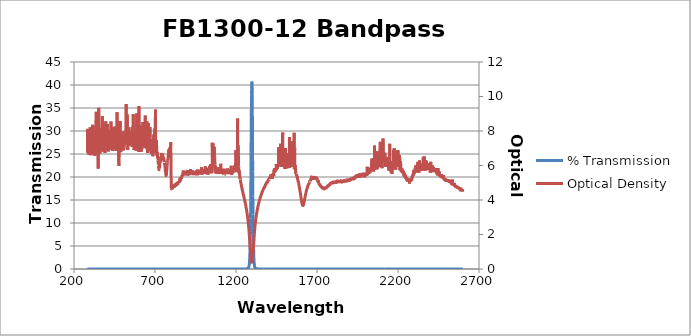
| Category | % Transmission |
|---|---|
| 2600.0 | 0.003 |
| 2599.0 | 0.003 |
| 2598.0 | 0.003 |
| 2597.0 | 0.002 |
| 2596.0 | 0.003 |
| 2595.0 | 0.003 |
| 2594.0 | 0.003 |
| 2593.0 | 0.002 |
| 2592.0 | 0.003 |
| 2591.0 | 0.003 |
| 2590.0 | 0.002 |
| 2589.0 | 0.002 |
| 2588.0 | 0.003 |
| 2587.0 | 0.003 |
| 2586.0 | 0.003 |
| 2585.0 | 0.002 |
| 2584.0 | 0.002 |
| 2583.0 | 0.002 |
| 2582.0 | 0.002 |
| 2581.0 | 0.002 |
| 2580.0 | 0.002 |
| 2579.0 | 0.002 |
| 2578.0 | 0.002 |
| 2577.0 | 0.002 |
| 2576.0 | 0.002 |
| 2575.0 | 0.002 |
| 2574.0 | 0.002 |
| 2573.0 | 0.002 |
| 2572.0 | 0.002 |
| 2571.0 | 0.002 |
| 2570.0 | 0.002 |
| 2569.0 | 0.002 |
| 2568.0 | 0.002 |
| 2567.0 | 0.002 |
| 2566.0 | 0.002 |
| 2565.0 | 0.002 |
| 2564.0 | 0.002 |
| 2563.0 | 0.002 |
| 2562.0 | 0.002 |
| 2561.0 | 0.002 |
| 2560.0 | 0.001 |
| 2559.0 | 0.002 |
| 2558.0 | 0.002 |
| 2557.0 | 0.002 |
| 2556.0 | 0.001 |
| 2555.0 | 0.001 |
| 2554.0 | 0.001 |
| 2553.0 | 0.002 |
| 2552.0 | 0.001 |
| 2551.0 | 0.001 |
| 2550.0 | 0.001 |
| 2549.0 | 0.001 |
| 2548.0 | 0.001 |
| 2547.0 | 0.001 |
| 2546.0 | 0.001 |
| 2545.0 | 0.001 |
| 2544.0 | 0.001 |
| 2543.0 | 0.001 |
| 2542.0 | 0.001 |
| 2541.0 | 0.001 |
| 2540.0 | 0.001 |
| 2539.0 | 0.001 |
| 2538.0 | 0.001 |
| 2537.0 | 0.001 |
| 2536.0 | 0.001 |
| 2535.0 | 0.001 |
| 2534.0 | 0.001 |
| 2533.0 | 0.001 |
| 2532.0 | 0.001 |
| 2531.0 | 0.001 |
| 2530.0 | 0.001 |
| 2529.0 | 0.001 |
| 2528.0 | 0.001 |
| 2527.0 | 0.001 |
| 2526.0 | 0.001 |
| 2525.0 | 0.001 |
| 2524.0 | 0.001 |
| 2523.0 | 0.001 |
| 2522.0 | 0.001 |
| 2521.0 | 0.001 |
| 2520.0 | 0.001 |
| 2519.0 | 0.001 |
| 2518.0 | 0.001 |
| 2517.0 | 0.001 |
| 2516.0 | 0.001 |
| 2515.0 | 0.001 |
| 2514.0 | 0.001 |
| 2513.0 | 0.001 |
| 2512.0 | 0.001 |
| 2511.0 | 0.001 |
| 2510.0 | 0.001 |
| 2509.0 | 0.001 |
| 2508.0 | 0.001 |
| 2507.0 | 0.001 |
| 2506.0 | 0.001 |
| 2505.0 | 0.001 |
| 2504.0 | 0.001 |
| 2503.0 | 0.001 |
| 2502.0 | 0.001 |
| 2501.0 | 0.001 |
| 2500.0 | 0.001 |
| 2499.0 | 0.001 |
| 2498.0 | 0.001 |
| 2497.0 | 0.001 |
| 2496.0 | 0.001 |
| 2495.0 | 0.001 |
| 2494.0 | 0.001 |
| 2493.0 | 0.001 |
| 2492.0 | 0.001 |
| 2491.0 | 0.001 |
| 2490.0 | 0.001 |
| 2489.0 | 0.001 |
| 2488.0 | 0.001 |
| 2487.0 | 0.001 |
| 2486.0 | 0.001 |
| 2485.0 | 0.001 |
| 2484.0 | 0.001 |
| 2483.0 | 0.001 |
| 2482.0 | 0 |
| 2481.0 | 0.001 |
| 2480.0 | 0.001 |
| 2479.0 | 0 |
| 2478.0 | 0.001 |
| 2477.0 | 0 |
| 2476.0 | 0 |
| 2475.0 | 0 |
| 2474.0 | 0 |
| 2473.0 | 0 |
| 2472.0 | 0.001 |
| 2471.0 | 0 |
| 2470.0 | 0 |
| 2469.0 | 0 |
| 2468.0 | 0 |
| 2467.0 | 0 |
| 2466.0 | 0 |
| 2465.0 | 0 |
| 2464.0 | 0 |
| 2463.0 | 0 |
| 2462.0 | 0 |
| 2461.0 | 0 |
| 2460.0 | 0 |
| 2459.0 | 0 |
| 2458.0 | 0 |
| 2457.0 | 0 |
| 2456.0 | 0 |
| 2455.0 | 0 |
| 2454.0 | 0 |
| 2453.0 | 0 |
| 2452.0 | 0 |
| 2451.0 | 0 |
| 2450.0 | 0 |
| 2449.0 | 0 |
| 2448.0 | 0 |
| 2447.0 | 0 |
| 2446.0 | 0 |
| 2445.0 | 0 |
| 2444.0 | 0 |
| 2443.0 | 0 |
| 2442.0 | 0 |
| 2441.0 | 0 |
| 2440.0 | 0 |
| 2439.0 | 0 |
| 2438.0 | 0 |
| 2437.0 | 0 |
| 2436.0 | 0 |
| 2435.0 | 0 |
| 2434.0 | 0 |
| 2433.0 | 0 |
| 2432.0 | 0 |
| 2431.0 | 0 |
| 2430.0 | 0 |
| 2429.0 | 0 |
| 2428.0 | 0 |
| 2427.0 | 0 |
| 2426.0 | 0 |
| 2425.0 | 0 |
| 2424.0 | 0 |
| 2423.0 | 0 |
| 2422.0 | 0 |
| 2421.0 | 0 |
| 2420.0 | 0 |
| 2419.0 | 0 |
| 2418.0 | 0 |
| 2417.0 | 0 |
| 2416.0 | 0 |
| 2415.0 | 0 |
| 2414.0 | 0 |
| 2413.0 | 0 |
| 2412.0 | 0 |
| 2411.0 | 0 |
| 2410.0 | 0 |
| 2409.0 | 0 |
| 2408.0 | 0 |
| 2407.0 | 0 |
| 2406.0 | 0 |
| 2405.0 | 0 |
| 2404.0 | 0 |
| 2403.0 | 0 |
| 2402.0 | 0 |
| 2401.0 | 0 |
| 2400.0 | 0 |
| 2399.0 | 0 |
| 2398.0 | 0 |
| 2397.0 | 0 |
| 2396.0 | 0 |
| 2395.0 | 0 |
| 2394.0 | 0 |
| 2393.0 | 0 |
| 2392.0 | 0 |
| 2391.0 | 0 |
| 2390.0 | 0 |
| 2389.0 | 0 |
| 2388.0 | 0 |
| 2387.0 | 0 |
| 2386.0 | 0 |
| 2385.0 | 0 |
| 2384.0 | 0 |
| 2383.0 | 0 |
| 2382.0 | 0 |
| 2381.0 | 0 |
| 2380.0 | 0 |
| 2379.0 | 0 |
| 2378.0 | 0 |
| 2377.0 | 0 |
| 2376.0 | 0 |
| 2375.0 | 0 |
| 2374.0 | 0 |
| 2373.0 | 0 |
| 2372.0 | 0 |
| 2371.0 | 0 |
| 2370.0 | 0 |
| 2369.0 | 0 |
| 2368.0 | 0 |
| 2367.0 | 0 |
| 2366.0 | 0 |
| 2365.0 | 0 |
| 2364.0 | 0 |
| 2363.0 | 0 |
| 2362.0 | 0 |
| 2361.0 | 0 |
| 2360.0 | 0 |
| 2359.0 | 0 |
| 2358.0 | 0 |
| 2357.0 | 0 |
| 2356.0 | 0 |
| 2355.0 | 0 |
| 2354.0 | 0 |
| 2353.0 | 0 |
| 2352.0 | 0 |
| 2351.0 | 0 |
| 2350.0 | 0 |
| 2349.0 | 0 |
| 2348.0 | 0 |
| 2347.0 | 0 |
| 2346.0 | 0 |
| 2345.0 | 0 |
| 2344.0 | 0 |
| 2343.0 | 0 |
| 2342.0 | 0 |
| 2341.0 | 0 |
| 2340.0 | 0 |
| 2339.0 | 0 |
| 2338.0 | 0 |
| 2337.0 | 0 |
| 2336.0 | 0 |
| 2335.0 | 0 |
| 2334.0 | 0 |
| 2333.0 | 0 |
| 2332.0 | 0 |
| 2331.0 | 0 |
| 2330.0 | 0 |
| 2329.0 | 0 |
| 2328.0 | 0 |
| 2327.0 | 0 |
| 2326.0 | 0 |
| 2325.0 | 0 |
| 2324.0 | 0 |
| 2323.0 | 0 |
| 2322.0 | 0 |
| 2321.0 | 0 |
| 2320.0 | 0 |
| 2319.0 | 0 |
| 2318.0 | 0 |
| 2317.0 | 0 |
| 2316.0 | 0 |
| 2315.0 | 0 |
| 2314.0 | 0 |
| 2313.0 | 0 |
| 2312.0 | 0 |
| 2311.0 | 0 |
| 2310.0 | 0 |
| 2309.0 | 0 |
| 2308.0 | 0 |
| 2307.0 | 0 |
| 2306.0 | 0 |
| 2305.0 | 0 |
| 2304.0 | 0 |
| 2303.0 | 0 |
| 2302.0 | 0 |
| 2301.0 | 0 |
| 2300.0 | 0 |
| 2299.0 | 0 |
| 2298.0 | 0 |
| 2297.0 | 0 |
| 2296.0 | 0 |
| 2295.0 | 0 |
| 2294.0 | 0 |
| 2293.0 | 0 |
| 2292.0 | 0 |
| 2291.0 | 0 |
| 2290.0 | 0 |
| 2289.0 | 0.001 |
| 2288.0 | 0 |
| 2287.0 | 0 |
| 2286.0 | 0.001 |
| 2285.0 | 0.001 |
| 2284.0 | 0.001 |
| 2283.0 | 0.001 |
| 2282.0 | 0.001 |
| 2281.0 | 0.001 |
| 2280.0 | 0.001 |
| 2279.0 | 0.001 |
| 2278.0 | 0.001 |
| 2277.0 | 0.001 |
| 2276.0 | 0.001 |
| 2275.0 | 0.001 |
| 2274.0 | 0.001 |
| 2273.0 | 0.001 |
| 2272.0 | 0.001 |
| 2271.0 | 0.001 |
| 2270.0 | 0.001 |
| 2269.0 | 0.001 |
| 2268.0 | 0.001 |
| 2267.0 | 0.001 |
| 2266.0 | 0.001 |
| 2265.0 | 0.001 |
| 2264.0 | 0.001 |
| 2263.0 | 0.001 |
| 2262.0 | 0.001 |
| 2261.0 | 0.001 |
| 2260.0 | 0.001 |
| 2259.0 | 0.001 |
| 2258.0 | 0.001 |
| 2257.0 | 0.001 |
| 2256.0 | 0.001 |
| 2255.0 | 0.001 |
| 2254.0 | 0 |
| 2253.0 | 0 |
| 2252.0 | 0.001 |
| 2251.0 | 0.001 |
| 2250.0 | 0.001 |
| 2249.0 | 0 |
| 2248.0 | 0 |
| 2247.0 | 0 |
| 2246.0 | 0 |
| 2245.0 | 0 |
| 2244.0 | 0 |
| 2243.0 | 0 |
| 2242.0 | 0 |
| 2241.0 | 0 |
| 2240.0 | 0 |
| 2239.0 | 0 |
| 2238.0 | 0 |
| 2237.0 | 0 |
| 2236.0 | 0 |
| 2235.0 | 0 |
| 2234.0 | 0 |
| 2233.0 | 0 |
| 2232.0 | 0 |
| 2231.0 | 0 |
| 2230.0 | 0 |
| 2229.0 | 0 |
| 2228.0 | 0 |
| 2227.0 | 0 |
| 2226.0 | 0 |
| 2225.0 | 0 |
| 2224.0 | 0 |
| 2223.0 | 0 |
| 2222.0 | 0 |
| 2221.0 | 0 |
| 2220.0 | 0 |
| 2219.0 | 0 |
| 2218.0 | 0 |
| 2217.0 | 0 |
| 2216.0 | 0 |
| 2215.0 | 0 |
| 2214.0 | 0 |
| 2213.0 | 0 |
| 2212.0 | 0 |
| 2211.0 | 0 |
| 2210.0 | 0 |
| 2209.0 | 0 |
| 2208.0 | 0 |
| 2207.0 | 0 |
| 2206.0 | 0 |
| 2205.0 | 0 |
| 2204.0 | 0 |
| 2203.0 | 0 |
| 2202.0 | 0 |
| 2201.0 | 0 |
| 2200.0 | 0 |
| 2199.0 | 0 |
| 2198.0 | 0 |
| 2197.0 | 0 |
| 2196.0 | 0 |
| 2195.0 | 0 |
| 2194.0 | 0 |
| 2193.0 | 0 |
| 2192.0 | 0 |
| 2191.0 | 0 |
| 2190.0 | 0 |
| 2189.0 | 0 |
| 2188.0 | 0 |
| 2187.0 | 0 |
| 2186.0 | 0 |
| 2185.0 | 0 |
| 2184.0 | 0 |
| 2183.0 | 0 |
| 2182.0 | 0 |
| 2181.0 | 0 |
| 2180.0 | 0 |
| 2179.0 | 0 |
| 2178.0 | 0 |
| 2177.0 | 0 |
| 2176.0 | 0 |
| 2175.0 | 0 |
| 2174.0 | 0 |
| 2173.0 | 0 |
| 2172.0 | 0 |
| 2171.0 | 0 |
| 2170.0 | 0 |
| 2169.0 | 0 |
| 2168.0 | 0 |
| 2167.0 | 0 |
| 2166.0 | 0 |
| 2165.0 | 0 |
| 2164.0 | 0 |
| 2163.0 | 0 |
| 2162.0 | 0 |
| 2161.0 | 0 |
| 2160.0 | 0 |
| 2159.0 | 0 |
| 2158.0 | 0 |
| 2157.0 | 0 |
| 2156.0 | 0 |
| 2155.0 | 0 |
| 2154.0 | 0 |
| 2153.0 | 0 |
| 2152.0 | 0 |
| 2151.0 | 0 |
| 2150.0 | 0 |
| 2149.0 | 0 |
| 2148.0 | 0 |
| 2147.0 | 0 |
| 2146.0 | 0 |
| 2145.0 | 0 |
| 2144.0 | 0 |
| 2143.0 | 0 |
| 2142.0 | 0 |
| 2141.0 | 0 |
| 2140.0 | 0 |
| 2139.0 | 0 |
| 2138.0 | 0 |
| 2137.0 | 0 |
| 2136.0 | 0 |
| 2135.0 | 0 |
| 2134.0 | 0 |
| 2133.0 | 0 |
| 2132.0 | 0 |
| 2131.0 | 0 |
| 2130.0 | 0 |
| 2129.0 | 0 |
| 2128.0 | 0 |
| 2127.0 | 0 |
| 2126.0 | 0 |
| 2125.0 | 0 |
| 2124.0 | 0 |
| 2123.0 | 0 |
| 2122.0 | 0 |
| 2121.0 | 0 |
| 2120.0 | 0 |
| 2119.0 | 0 |
| 2118.0 | 0 |
| 2117.0 | 0 |
| 2116.0 | 0 |
| 2115.0 | 0 |
| 2114.0 | 0 |
| 2113.0 | 0 |
| 2112.0 | 0 |
| 2111.0 | 0 |
| 2110.0 | 0 |
| 2109.0 | 0 |
| 2108.0 | 0 |
| 2107.0 | 0 |
| 2106.0 | 0 |
| 2105.0 | 0 |
| 2104.0 | 0 |
| 2103.0 | 0 |
| 2102.0 | 0 |
| 2101.0 | 0 |
| 2100.0 | 0 |
| 2099.0 | 0 |
| 2098.0 | 0 |
| 2097.0 | 0 |
| 2096.0 | 0 |
| 2095.0 | 0 |
| 2094.0 | 0 |
| 2093.0 | 0 |
| 2092.0 | 0 |
| 2091.0 | 0 |
| 2090.0 | 0 |
| 2089.0 | 0 |
| 2088.0 | 0 |
| 2087.0 | 0 |
| 2086.0 | 0 |
| 2085.0 | 0 |
| 2084.0 | 0 |
| 2083.0 | 0 |
| 2082.0 | 0 |
| 2081.0 | 0 |
| 2080.0 | 0 |
| 2079.0 | 0 |
| 2078.0 | 0 |
| 2077.0 | 0 |
| 2076.0 | 0 |
| 2075.0 | 0 |
| 2074.0 | 0 |
| 2073.0 | 0 |
| 2072.0 | 0 |
| 2071.0 | 0 |
| 2070.0 | 0 |
| 2069.0 | 0 |
| 2068.0 | 0 |
| 2067.0 | 0 |
| 2066.0 | 0 |
| 2065.0 | 0 |
| 2064.0 | 0 |
| 2063.0 | 0 |
| 2062.0 | 0 |
| 2061.0 | 0 |
| 2060.0 | 0 |
| 2059.0 | 0 |
| 2058.0 | 0 |
| 2057.0 | 0 |
| 2056.0 | 0 |
| 2055.0 | 0 |
| 2054.0 | 0 |
| 2053.0 | 0 |
| 2052.0 | 0 |
| 2051.0 | 0 |
| 2050.0 | 0 |
| 2049.0 | 0 |
| 2048.0 | 0 |
| 2047.0 | 0 |
| 2046.0 | 0 |
| 2045.0 | 0 |
| 2044.0 | 0 |
| 2043.0 | 0 |
| 2042.0 | 0 |
| 2041.0 | 0 |
| 2040.0 | 0 |
| 2039.0 | 0 |
| 2038.0 | 0 |
| 2037.0 | 0 |
| 2036.0 | 0 |
| 2035.0 | 0 |
| 2034.0 | 0 |
| 2033.0 | 0 |
| 2032.0 | 0 |
| 2031.0 | 0 |
| 2030.0 | 0 |
| 2029.0 | 0 |
| 2028.0 | 0 |
| 2027.0 | 0 |
| 2026.0 | 0 |
| 2025.0 | 0 |
| 2024.0 | 0 |
| 2023.0 | 0 |
| 2022.0 | 0 |
| 2021.0 | 0 |
| 2020.0 | 0 |
| 2019.0 | 0 |
| 2018.0 | 0 |
| 2017.0 | 0 |
| 2016.0 | 0 |
| 2015.0 | 0 |
| 2014.0 | 0 |
| 2013.0 | 0 |
| 2012.0 | 0 |
| 2011.0 | 0 |
| 2010.0 | 0 |
| 2009.0 | 0 |
| 2008.0 | 0 |
| 2007.0 | 0 |
| 2006.0 | 0 |
| 2005.0 | 0 |
| 2004.0 | 0 |
| 2003.0 | 0 |
| 2002.0 | 0 |
| 2001.0 | 0 |
| 2000.0 | 0 |
| 1999.0 | 0 |
| 1998.0 | 0 |
| 1997.0 | 0 |
| 1996.0 | 0 |
| 1995.0 | 0 |
| 1994.0 | 0 |
| 1993.0 | 0 |
| 1992.0 | 0 |
| 1991.0 | 0 |
| 1990.0 | 0 |
| 1989.0 | 0 |
| 1988.0 | 0 |
| 1987.0 | 0 |
| 1986.0 | 0 |
| 1985.0 | 0 |
| 1984.0 | 0 |
| 1983.0 | 0 |
| 1982.0 | 0 |
| 1981.0 | 0 |
| 1980.0 | 0 |
| 1979.0 | 0 |
| 1978.0 | 0 |
| 1977.0 | 0 |
| 1976.0 | 0 |
| 1975.0 | 0 |
| 1974.0 | 0 |
| 1973.0 | 0 |
| 1972.0 | 0 |
| 1971.0 | 0 |
| 1970.0 | 0 |
| 1969.0 | 0 |
| 1968.0 | 0 |
| 1967.0 | 0 |
| 1966.0 | 0.001 |
| 1965.0 | 0 |
| 1964.0 | 0 |
| 1963.0 | 0 |
| 1962.0 | 0 |
| 1961.0 | 0 |
| 1960.0 | 0 |
| 1959.0 | 0 |
| 1958.0 | 0 |
| 1957.0 | 0 |
| 1956.0 | 0 |
| 1955.0 | 0 |
| 1954.0 | 0 |
| 1953.0 | 0 |
| 1952.0 | 0 |
| 1951.0 | 0 |
| 1950.0 | 0 |
| 1949.0 | 0 |
| 1948.0 | 0 |
| 1947.0 | 0.001 |
| 1946.0 | 0 |
| 1945.0 | 0 |
| 1944.0 | 0 |
| 1943.0 | 0 |
| 1942.0 | 0 |
| 1941.0 | 0 |
| 1940.0 | 0 |
| 1939.0 | 0.001 |
| 1938.0 | 0.001 |
| 1937.0 | 0 |
| 1936.0 | 0.001 |
| 1935.0 | 0 |
| 1934.0 | 0.001 |
| 1933.0 | 0 |
| 1932.0 | 0.001 |
| 1931.0 | 0 |
| 1930.0 | 0.001 |
| 1929.0 | 0.001 |
| 1928.0 | 0.001 |
| 1927.0 | 0.001 |
| 1926.0 | 0.001 |
| 1925.0 | 0.001 |
| 1924.0 | 0.001 |
| 1923.0 | 0.001 |
| 1922.0 | 0.001 |
| 1921.0 | 0.001 |
| 1920.0 | 0.001 |
| 1919.0 | 0.001 |
| 1918.0 | 0.001 |
| 1917.0 | 0.001 |
| 1916.0 | 0.001 |
| 1915.0 | 0.001 |
| 1914.0 | 0.001 |
| 1913.0 | 0.001 |
| 1912.0 | 0.001 |
| 1911.0 | 0.001 |
| 1910.0 | 0.001 |
| 1909.0 | 0.001 |
| 1908.0 | 0.001 |
| 1907.0 | 0.001 |
| 1906.0 | 0.001 |
| 1905.0 | 0.001 |
| 1904.0 | 0.001 |
| 1903.0 | 0.001 |
| 1902.0 | 0.001 |
| 1901.0 | 0.001 |
| 1900.0 | 0.001 |
| 1899.0 | 0.001 |
| 1898.0 | 0.001 |
| 1897.0 | 0.001 |
| 1896.0 | 0.001 |
| 1895.0 | 0.001 |
| 1894.0 | 0.001 |
| 1893.0 | 0.001 |
| 1892.0 | 0.001 |
| 1891.0 | 0.001 |
| 1890.0 | 0.001 |
| 1889.0 | 0.001 |
| 1888.0 | 0.001 |
| 1887.0 | 0.001 |
| 1886.0 | 0.001 |
| 1885.0 | 0.001 |
| 1884.0 | 0.001 |
| 1883.0 | 0.001 |
| 1882.0 | 0.001 |
| 1881.0 | 0.001 |
| 1880.0 | 0.001 |
| 1879.0 | 0.001 |
| 1878.0 | 0.001 |
| 1877.0 | 0.001 |
| 1876.0 | 0.001 |
| 1875.0 | 0.001 |
| 1874.0 | 0.001 |
| 1873.0 | 0.001 |
| 1872.0 | 0.001 |
| 1871.0 | 0.001 |
| 1870.0 | 0.001 |
| 1869.0 | 0.001 |
| 1868.0 | 0.001 |
| 1867.0 | 0.001 |
| 1866.0 | 0.001 |
| 1865.0 | 0.001 |
| 1864.0 | 0.001 |
| 1863.0 | 0.001 |
| 1862.0 | 0.001 |
| 1861.0 | 0.001 |
| 1860.0 | 0.001 |
| 1859.0 | 0.001 |
| 1858.0 | 0.001 |
| 1857.0 | 0.001 |
| 1856.0 | 0.001 |
| 1855.0 | 0.001 |
| 1854.0 | 0.001 |
| 1853.0 | 0.001 |
| 1852.0 | 0.001 |
| 1851.0 | 0.001 |
| 1850.0 | 0.001 |
| 1849.0 | 0.001 |
| 1848.0 | 0.001 |
| 1847.0 | 0.001 |
| 1846.0 | 0.001 |
| 1845.0 | 0.001 |
| 1844.0 | 0.001 |
| 1843.0 | 0.001 |
| 1842.0 | 0.001 |
| 1841.0 | 0.001 |
| 1840.0 | 0.001 |
| 1839.0 | 0.001 |
| 1838.0 | 0.001 |
| 1837.0 | 0.001 |
| 1836.0 | 0.001 |
| 1835.0 | 0.001 |
| 1834.0 | 0.001 |
| 1833.0 | 0.001 |
| 1832.0 | 0.001 |
| 1831.0 | 0.001 |
| 1830.0 | 0.001 |
| 1829.0 | 0.001 |
| 1828.0 | 0.001 |
| 1827.0 | 0.001 |
| 1826.0 | 0.001 |
| 1825.0 | 0.001 |
| 1824.0 | 0.001 |
| 1823.0 | 0.001 |
| 1822.0 | 0.001 |
| 1821.0 | 0.001 |
| 1820.0 | 0.001 |
| 1819.0 | 0.001 |
| 1818.0 | 0.001 |
| 1817.0 | 0.001 |
| 1816.0 | 0.001 |
| 1815.0 | 0.001 |
| 1814.0 | 0.001 |
| 1813.0 | 0.001 |
| 1812.0 | 0.001 |
| 1811.0 | 0.001 |
| 1810.0 | 0.001 |
| 1809.0 | 0.001 |
| 1808.0 | 0.001 |
| 1807.0 | 0.001 |
| 1806.0 | 0.001 |
| 1805.0 | 0.001 |
| 1804.0 | 0.001 |
| 1803.0 | 0.001 |
| 1802.0 | 0.001 |
| 1801.0 | 0.001 |
| 1800.0 | 0.001 |
| 1799.0 | 0.001 |
| 1798.0 | 0.001 |
| 1797.0 | 0.001 |
| 1796.0 | 0.001 |
| 1795.0 | 0.001 |
| 1794.0 | 0.001 |
| 1793.0 | 0.001 |
| 1792.0 | 0.001 |
| 1791.0 | 0.001 |
| 1790.0 | 0.001 |
| 1789.0 | 0.001 |
| 1788.0 | 0.001 |
| 1787.0 | 0.001 |
| 1786.0 | 0.001 |
| 1785.0 | 0.001 |
| 1784.0 | 0.001 |
| 1783.0 | 0.001 |
| 1782.0 | 0.001 |
| 1781.0 | 0.001 |
| 1780.0 | 0.001 |
| 1779.0 | 0.001 |
| 1778.0 | 0.001 |
| 1777.0 | 0.001 |
| 1776.0 | 0.001 |
| 1775.0 | 0.001 |
| 1774.0 | 0.001 |
| 1773.0 | 0.001 |
| 1772.0 | 0.001 |
| 1771.0 | 0.001 |
| 1770.0 | 0.001 |
| 1769.0 | 0.002 |
| 1768.0 | 0.002 |
| 1767.0 | 0.002 |
| 1766.0 | 0.001 |
| 1765.0 | 0.002 |
| 1764.0 | 0.002 |
| 1763.0 | 0.002 |
| 1762.0 | 0.002 |
| 1761.0 | 0.002 |
| 1760.0 | 0.002 |
| 1759.0 | 0.002 |
| 1758.0 | 0.002 |
| 1757.0 | 0.002 |
| 1756.0 | 0.002 |
| 1755.0 | 0.002 |
| 1754.0 | 0.002 |
| 1753.0 | 0.002 |
| 1752.0 | 0.002 |
| 1751.0 | 0.002 |
| 1750.0 | 0.002 |
| 1749.0 | 0.002 |
| 1748.0 | 0.002 |
| 1747.0 | 0.002 |
| 1746.0 | 0.002 |
| 1745.0 | 0.002 |
| 1744.0 | 0.002 |
| 1743.0 | 0.002 |
| 1742.0 | 0.002 |
| 1741.0 | 0.002 |
| 1740.0 | 0.002 |
| 1739.0 | 0.002 |
| 1738.0 | 0.002 |
| 1737.0 | 0.002 |
| 1736.0 | 0.002 |
| 1735.0 | 0.002 |
| 1734.0 | 0.002 |
| 1733.0 | 0.002 |
| 1732.0 | 0.002 |
| 1731.0 | 0.002 |
| 1730.0 | 0.002 |
| 1729.0 | 0.002 |
| 1728.0 | 0.002 |
| 1727.0 | 0.002 |
| 1726.0 | 0.002 |
| 1725.0 | 0.002 |
| 1724.0 | 0.002 |
| 1723.0 | 0.002 |
| 1722.0 | 0.002 |
| 1721.0 | 0.001 |
| 1720.0 | 0.002 |
| 1719.0 | 0.001 |
| 1718.0 | 0.001 |
| 1717.0 | 0.001 |
| 1716.0 | 0.001 |
| 1715.0 | 0.001 |
| 1714.0 | 0.001 |
| 1713.0 | 0.001 |
| 1712.0 | 0.001 |
| 1711.0 | 0.001 |
| 1710.0 | 0.001 |
| 1709.0 | 0.001 |
| 1708.0 | 0.001 |
| 1707.0 | 0.001 |
| 1706.0 | 0.001 |
| 1705.0 | 0.001 |
| 1704.0 | 0.001 |
| 1703.0 | 0.001 |
| 1702.0 | 0.001 |
| 1701.0 | 0.001 |
| 1700.0 | 0.001 |
| 1699.0 | 0.001 |
| 1698.0 | 0.001 |
| 1697.0 | 0.001 |
| 1696.0 | 0.001 |
| 1695.0 | 0.001 |
| 1694.0 | 0.001 |
| 1693.0 | 0 |
| 1692.0 | 0.001 |
| 1691.0 | 0.001 |
| 1690.0 | 0.001 |
| 1689.0 | 0.001 |
| 1688.0 | 0.001 |
| 1687.0 | 0 |
| 1686.0 | 0 |
| 1685.0 | 0.001 |
| 1684.0 | 0.001 |
| 1683.0 | 0.001 |
| 1682.0 | 0 |
| 1681.0 | 0.001 |
| 1680.0 | 0 |
| 1679.0 | 0.001 |
| 1678.0 | 0.001 |
| 1677.0 | 0.001 |
| 1676.0 | 0.001 |
| 1675.0 | 0 |
| 1674.0 | 0 |
| 1673.0 | 0.001 |
| 1672.0 | 0.001 |
| 1671.0 | 0.001 |
| 1670.0 | 0.001 |
| 1669.0 | 0.001 |
| 1668.0 | 0.001 |
| 1667.0 | 0 |
| 1666.0 | 0 |
| 1665.0 | 0.001 |
| 1664.0 | 0.001 |
| 1663.0 | 0.001 |
| 1662.0 | 0.001 |
| 1661.0 | 0.001 |
| 1660.0 | 0.001 |
| 1659.0 | 0.001 |
| 1658.0 | 0.001 |
| 1657.0 | 0.001 |
| 1656.0 | 0.001 |
| 1655.0 | 0.001 |
| 1654.0 | 0.001 |
| 1653.0 | 0.001 |
| 1652.0 | 0.001 |
| 1651.0 | 0.001 |
| 1650.0 | 0.001 |
| 1649.0 | 0.001 |
| 1648.0 | 0.001 |
| 1647.0 | 0.001 |
| 1646.0 | 0.001 |
| 1645.0 | 0.001 |
| 1644.0 | 0.001 |
| 1643.0 | 0.002 |
| 1642.0 | 0.002 |
| 1641.0 | 0.002 |
| 1640.0 | 0.002 |
| 1639.0 | 0.002 |
| 1638.0 | 0.002 |
| 1637.0 | 0.002 |
| 1636.0 | 0.003 |
| 1635.0 | 0.003 |
| 1634.0 | 0.003 |
| 1633.0 | 0.003 |
| 1632.0 | 0.004 |
| 1631.0 | 0.004 |
| 1630.0 | 0.004 |
| 1629.0 | 0.005 |
| 1628.0 | 0.005 |
| 1627.0 | 0.006 |
| 1626.0 | 0.007 |
| 1625.0 | 0.008 |
| 1624.0 | 0.009 |
| 1623.0 | 0.01 |
| 1622.0 | 0.011 |
| 1621.0 | 0.013 |
| 1620.0 | 0.014 |
| 1619.0 | 0.015 |
| 1618.0 | 0.017 |
| 1617.0 | 0.018 |
| 1616.0 | 0.019 |
| 1615.0 | 0.02 |
| 1614.0 | 0.021 |
| 1613.0 | 0.021 |
| 1612.0 | 0.021 |
| 1611.0 | 0.02 |
| 1610.0 | 0.019 |
| 1609.0 | 0.018 |
| 1608.0 | 0.017 |
| 1607.0 | 0.015 |
| 1606.0 | 0.014 |
| 1605.0 | 0.012 |
| 1604.0 | 0.011 |
| 1603.0 | 0.009 |
| 1602.0 | 0.008 |
| 1601.0 | 0.007 |
| 1600.0 | 0.006 |
| 1599.0 | 0.005 |
| 1598.0 | 0.004 |
| 1597.0 | 0.004 |
| 1596.0 | 0.003 |
| 1595.0 | 0.003 |
| 1594.0 | 0.003 |
| 1593.0 | 0.002 |
| 1592.0 | 0.002 |
| 1591.0 | 0.002 |
| 1590.0 | 0.002 |
| 1589.0 | 0.001 |
| 1588.0 | 0.001 |
| 1587.0 | 0.001 |
| 1586.0 | 0.001 |
| 1585.0 | 0.001 |
| 1584.0 | 0.001 |
| 1583.0 | 0.001 |
| 1582.0 | 0.001 |
| 1581.0 | 0.001 |
| 1580.0 | 0.001 |
| 1579.0 | 0.001 |
| 1578.0 | 0 |
| 1577.0 | 0.001 |
| 1576.0 | 0 |
| 1575.0 | 0 |
| 1574.0 | 0 |
| 1573.0 | 0 |
| 1572.0 | 0 |
| 1571.0 | 0 |
| 1570.0 | 0 |
| 1569.0 | 0 |
| 1568.0 | 0 |
| 1567.0 | 0 |
| 1566.0 | 0 |
| 1565.0 | 0 |
| 1564.0 | 0 |
| 1563.0 | 0 |
| 1562.0 | 0 |
| 1561.0 | 0 |
| 1560.0 | 0 |
| 1559.0 | 0 |
| 1558.0 | 0 |
| 1557.0 | 0 |
| 1556.0 | 0 |
| 1555.0 | 0 |
| 1554.0 | 0 |
| 1553.0 | 0 |
| 1552.0 | 0 |
| 1551.0 | 0 |
| 1550.0 | 0 |
| 1549.0 | 0 |
| 1548.0 | 0 |
| 1547.0 | 0 |
| 1546.0 | 0 |
| 1545.0 | 0 |
| 1544.0 | 0 |
| 1543.0 | 0 |
| 1542.0 | 0 |
| 1541.0 | 0 |
| 1540.0 | 0 |
| 1539.0 | 0 |
| 1538.0 | 0 |
| 1537.0 | 0 |
| 1536.0 | 0 |
| 1535.0 | 0 |
| 1534.0 | 0 |
| 1533.0 | 0 |
| 1532.0 | 0 |
| 1531.0 | 0 |
| 1530.0 | 0 |
| 1529.0 | 0 |
| 1528.0 | 0 |
| 1527.0 | 0 |
| 1526.0 | 0 |
| 1525.0 | 0 |
| 1524.0 | 0 |
| 1523.0 | 0 |
| 1522.0 | 0 |
| 1521.0 | 0 |
| 1520.0 | 0 |
| 1519.0 | 0 |
| 1518.0 | 0 |
| 1517.0 | 0 |
| 1516.0 | 0 |
| 1515.0 | 0 |
| 1514.0 | 0 |
| 1513.0 | 0 |
| 1512.0 | 0 |
| 1511.0 | 0 |
| 1510.0 | 0 |
| 1509.0 | 0 |
| 1508.0 | 0 |
| 1507.0 | 0 |
| 1506.0 | 0 |
| 1505.0 | 0 |
| 1504.0 | 0 |
| 1503.0 | 0 |
| 1502.0 | 0 |
| 1501.0 | 0 |
| 1500.0 | 0 |
| 1499.0 | 0 |
| 1498.0 | 0 |
| 1497.0 | 0 |
| 1496.0 | 0 |
| 1495.0 | 0 |
| 1494.0 | 0 |
| 1493.0 | 0 |
| 1492.0 | 0 |
| 1491.0 | 0 |
| 1490.0 | 0 |
| 1489.0 | 0 |
| 1488.0 | 0 |
| 1487.0 | 0 |
| 1486.0 | 0 |
| 1485.0 | 0 |
| 1484.0 | 0 |
| 1483.0 | 0 |
| 1482.0 | 0 |
| 1481.0 | 0 |
| 1480.0 | 0 |
| 1479.0 | 0 |
| 1478.0 | 0 |
| 1477.0 | 0 |
| 1476.0 | 0 |
| 1475.0 | 0 |
| 1474.0 | 0 |
| 1473.0 | 0 |
| 1472.0 | 0 |
| 1471.0 | 0 |
| 1470.0 | 0 |
| 1469.0 | 0 |
| 1468.0 | 0 |
| 1467.0 | 0 |
| 1466.0 | 0 |
| 1465.0 | 0 |
| 1464.0 | 0 |
| 1463.0 | 0 |
| 1462.0 | 0 |
| 1461.0 | 0 |
| 1460.0 | 0 |
| 1459.0 | 0 |
| 1458.0 | 0 |
| 1457.0 | 0 |
| 1456.0 | 0 |
| 1455.0 | 0 |
| 1454.0 | 0 |
| 1453.0 | 0 |
| 1452.0 | 0 |
| 1451.0 | 0 |
| 1450.0 | 0 |
| 1449.0 | 0 |
| 1448.0 | 0 |
| 1447.0 | 0 |
| 1446.0 | 0 |
| 1445.0 | 0 |
| 1444.0 | 0 |
| 1443.0 | 0 |
| 1442.0 | 0 |
| 1441.0 | 0 |
| 1440.0 | 0 |
| 1439.0 | 0 |
| 1438.0 | 0 |
| 1437.0 | 0 |
| 1436.0 | 0 |
| 1435.0 | 0 |
| 1434.0 | 0 |
| 1433.0 | 0 |
| 1432.0 | 0 |
| 1431.0 | 0 |
| 1430.0 | 0 |
| 1429.0 | 0 |
| 1428.0 | 0 |
| 1427.0 | 0 |
| 1426.0 | 0 |
| 1425.0 | 0 |
| 1424.0 | 0.001 |
| 1423.0 | 0 |
| 1422.0 | 0 |
| 1421.0 | 0 |
| 1420.0 | 0 |
| 1419.0 | 0 |
| 1418.0 | 0 |
| 1417.0 | 0.001 |
| 1416.0 | 0 |
| 1415.0 | 0 |
| 1414.0 | 0 |
| 1413.0 | 0 |
| 1412.0 | 0 |
| 1411.0 | 0.001 |
| 1410.0 | 0 |
| 1409.0 | 0.001 |
| 1408.0 | 0.001 |
| 1407.0 | 0.001 |
| 1406.0 | 0.001 |
| 1405.0 | 0.001 |
| 1404.0 | 0.001 |
| 1403.0 | 0.001 |
| 1402.0 | 0.001 |
| 1401.0 | 0.001 |
| 1400.0 | 0.001 |
| 1399.0 | 0.001 |
| 1398.0 | 0.001 |
| 1397.0 | 0.001 |
| 1396.0 | 0.001 |
| 1395.0 | 0.001 |
| 1394.0 | 0.001 |
| 1393.0 | 0.001 |
| 1392.0 | 0.001 |
| 1391.0 | 0.001 |
| 1390.0 | 0.001 |
| 1389.0 | 0.001 |
| 1388.0 | 0.001 |
| 1387.0 | 0.001 |
| 1386.0 | 0.001 |
| 1385.0 | 0.001 |
| 1384.0 | 0.001 |
| 1383.0 | 0.001 |
| 1382.0 | 0.001 |
| 1381.0 | 0.001 |
| 1380.0 | 0.002 |
| 1379.0 | 0.002 |
| 1378.0 | 0.002 |
| 1377.0 | 0.002 |
| 1376.0 | 0.002 |
| 1375.0 | 0.002 |
| 1374.0 | 0.002 |
| 1373.0 | 0.002 |
| 1372.0 | 0.002 |
| 1371.0 | 0.002 |
| 1370.0 | 0.002 |
| 1369.0 | 0.002 |
| 1368.0 | 0.002 |
| 1367.0 | 0.003 |
| 1366.0 | 0.003 |
| 1365.0 | 0.003 |
| 1364.0 | 0.003 |
| 1363.0 | 0.003 |
| 1362.0 | 0.003 |
| 1361.0 | 0.004 |
| 1360.0 | 0.004 |
| 1359.0 | 0.004 |
| 1358.0 | 0.004 |
| 1357.0 | 0.005 |
| 1356.0 | 0.005 |
| 1355.0 | 0.005 |
| 1354.0 | 0.006 |
| 1353.0 | 0.006 |
| 1352.0 | 0.006 |
| 1351.0 | 0.007 |
| 1350.0 | 0.007 |
| 1349.0 | 0.008 |
| 1348.0 | 0.008 |
| 1347.0 | 0.009 |
| 1346.0 | 0.01 |
| 1345.0 | 0.01 |
| 1344.0 | 0.011 |
| 1343.0 | 0.012 |
| 1342.0 | 0.013 |
| 1341.0 | 0.014 |
| 1340.0 | 0.016 |
| 1339.0 | 0.017 |
| 1338.0 | 0.019 |
| 1337.0 | 0.02 |
| 1336.0 | 0.022 |
| 1335.0 | 0.025 |
| 1334.0 | 0.028 |
| 1333.0 | 0.031 |
| 1332.0 | 0.034 |
| 1331.0 | 0.038 |
| 1330.0 | 0.043 |
| 1329.0 | 0.049 |
| 1328.0 | 0.056 |
| 1327.0 | 0.064 |
| 1326.0 | 0.073 |
| 1325.0 | 0.084 |
| 1324.0 | 0.098 |
| 1323.0 | 0.115 |
| 1322.0 | 0.135 |
| 1321.0 | 0.161 |
| 1320.0 | 0.194 |
| 1319.0 | 0.234 |
| 1318.0 | 0.287 |
| 1317.0 | 0.356 |
| 1316.0 | 0.447 |
| 1315.0 | 0.575 |
| 1314.0 | 0.752 |
| 1313.0 | 0.998 |
| 1312.0 | 1.347 |
| 1311.0 | 1.878 |
| 1310.0 | 2.65 |
| 1309.0 | 3.814 |
| 1308.0 | 5.21 |
| 1307.0 | 6.982 |
| 1306.0 | 8.868 |
| 1305.0 | 11.842 |
| 1304.0 | 15.918 |
| 1303.0 | 21.176 |
| 1302.0 | 27.585 |
| 1301.0 | 33.815 |
| 1300.0 | 38.228 |
| 1299.0 | 40.482 |
| 1298.0 | 40.75 |
| 1297.0 | 39.817 |
| 1296.0 | 37.957 |
| 1295.0 | 34.917 |
| 1294.0 | 30.636 |
| 1293.0 | 25.388 |
| 1292.0 | 19.78 |
| 1291.0 | 14.87 |
| 1290.0 | 10.998 |
| 1289.0 | 8.074 |
| 1288.0 | 6.087 |
| 1287.0 | 4.795 |
| 1286.0 | 3.661 |
| 1285.0 | 2.703 |
| 1284.0 | 1.943 |
| 1283.0 | 1.383 |
| 1282.0 | 1.007 |
| 1281.0 | 0.758 |
| 1280.0 | 0.575 |
| 1279.0 | 0.447 |
| 1278.0 | 0.351 |
| 1277.0 | 0.28 |
| 1276.0 | 0.226 |
| 1275.0 | 0.184 |
| 1274.0 | 0.153 |
| 1273.0 | 0.127 |
| 1272.0 | 0.107 |
| 1271.0 | 0.091 |
| 1270.0 | 0.077 |
| 1269.0 | 0.066 |
| 1268.0 | 0.057 |
| 1267.0 | 0.049 |
| 1266.0 | 0.043 |
| 1265.0 | 0.037 |
| 1264.0 | 0.033 |
| 1263.0 | 0.029 |
| 1262.0 | 0.026 |
| 1261.0 | 0.023 |
| 1260.0 | 0.02 |
| 1259.0 | 0.018 |
| 1258.0 | 0.016 |
| 1257.0 | 0.015 |
| 1256.0 | 0.013 |
| 1255.0 | 0.012 |
| 1254.0 | 0.011 |
| 1253.0 | 0.01 |
| 1252.0 | 0.009 |
| 1251.0 | 0.008 |
| 1250.0 | 0.007 |
| 1249.0 | 0.007 |
| 1248.0 | 0.006 |
| 1247.0 | 0.006 |
| 1246.0 | 0.005 |
| 1245.0 | 0.005 |
| 1244.0 | 0.004 |
| 1243.0 | 0.004 |
| 1242.0 | 0.004 |
| 1241.0 | 0.003 |
| 1240.0 | 0.003 |
| 1239.0 | 0.003 |
| 1238.0 | 0.002 |
| 1237.0 | 0.002 |
| 1236.0 | 0.002 |
| 1235.0 | 0.002 |
| 1234.0 | 0.002 |
| 1233.0 | 0.001 |
| 1232.0 | 0.001 |
| 1231.0 | 0.001 |
| 1230.0 | 0.001 |
| 1229.0 | 0.001 |
| 1228.0 | 0.001 |
| 1227.0 | 0.001 |
| 1226.0 | 0.001 |
| 1225.0 | 0.001 |
| 1224.0 | 0.001 |
| 1223.0 | 0 |
| 1222.0 | 0 |
| 1221.0 | 0 |
| 1220.0 | 0 |
| 1219.0 | 0 |
| 1218.0 | 0 |
| 1217.0 | 0 |
| 1216.0 | 0 |
| 1215.0 | 0 |
| 1214.0 | 0 |
| 1213.0 | 0 |
| 1212.0 | 0 |
| 1211.0 | 0 |
| 1210.0 | 0 |
| 1209.0 | 0 |
| 1208.0 | 0 |
| 1207.0 | 0 |
| 1206.0 | 0 |
| 1205.0 | 0 |
| 1204.0 | 0 |
| 1203.0 | 0 |
| 1202.0 | 0 |
| 1201.0 | 0 |
| 1200.0 | 0 |
| 1199.0 | 0 |
| 1198.0 | 0 |
| 1197.0 | 0 |
| 1196.0 | 0 |
| 1195.0 | 0 |
| 1194.0 | 0 |
| 1193.0 | 0 |
| 1192.0 | 0 |
| 1191.0 | 0 |
| 1190.0 | 0 |
| 1189.0 | 0 |
| 1188.0 | 0 |
| 1187.0 | 0 |
| 1186.0 | 0 |
| 1185.0 | 0 |
| 1184.0 | 0 |
| 1183.0 | 0 |
| 1182.0 | 0 |
| 1181.0 | 0 |
| 1180.0 | 0 |
| 1179.0 | 0 |
| 1178.0 | 0 |
| 1177.0 | 0 |
| 1176.0 | 0 |
| 1175.0 | 0 |
| 1174.0 | 0 |
| 1173.0 | 0 |
| 1172.0 | 0 |
| 1171.0 | 0 |
| 1170.0 | 0 |
| 1169.0 | 0 |
| 1168.0 | 0 |
| 1167.0 | 0 |
| 1166.0 | 0 |
| 1165.0 | 0 |
| 1164.0 | 0 |
| 1163.0 | 0 |
| 1162.0 | 0 |
| 1161.0 | 0 |
| 1160.0 | 0 |
| 1159.0 | 0 |
| 1158.0 | 0 |
| 1157.0 | 0 |
| 1156.0 | 0 |
| 1155.0 | 0 |
| 1154.0 | 0 |
| 1153.0 | 0 |
| 1152.0 | 0 |
| 1151.0 | 0 |
| 1150.0 | 0 |
| 1149.0 | 0 |
| 1148.0 | 0 |
| 1147.0 | 0 |
| 1146.0 | 0 |
| 1145.0 | 0 |
| 1144.0 | 0 |
| 1143.0 | 0 |
| 1142.0 | 0 |
| 1141.0 | 0 |
| 1140.0 | 0 |
| 1139.0 | 0 |
| 1138.0 | 0 |
| 1137.0 | 0 |
| 1136.0 | 0 |
| 1135.0 | 0 |
| 1134.0 | 0 |
| 1133.0 | 0 |
| 1132.0 | 0 |
| 1131.0 | 0 |
| 1130.0 | 0 |
| 1129.0 | 0 |
| 1128.0 | 0 |
| 1127.0 | 0 |
| 1126.0 | 0 |
| 1125.0 | 0 |
| 1124.0 | 0 |
| 1123.0 | 0 |
| 1122.0 | 0 |
| 1121.0 | 0 |
| 1120.0 | 0 |
| 1119.0 | 0 |
| 1118.0 | 0 |
| 1117.0 | 0 |
| 1116.0 | 0 |
| 1115.0 | 0 |
| 1114.0 | 0 |
| 1113.0 | 0 |
| 1112.0 | 0 |
| 1111.0 | 0 |
| 1110.0 | 0 |
| 1109.0 | 0 |
| 1108.0 | 0 |
| 1107.0 | 0 |
| 1106.0 | 0 |
| 1105.0 | 0 |
| 1104.0 | 0 |
| 1103.0 | 0 |
| 1102.0 | 0 |
| 1101.0 | 0 |
| 1100.0 | 0 |
| 1099.0 | 0 |
| 1098.0 | 0 |
| 1097.0 | 0 |
| 1096.0 | 0 |
| 1095.0 | 0 |
| 1094.0 | 0 |
| 1093.0 | 0 |
| 1092.0 | 0 |
| 1091.0 | 0 |
| 1090.0 | 0 |
| 1089.0 | 0 |
| 1088.0 | 0 |
| 1087.0 | 0 |
| 1086.0 | 0 |
| 1085.0 | 0 |
| 1084.0 | 0 |
| 1083.0 | 0 |
| 1082.0 | 0 |
| 1081.0 | 0 |
| 1080.0 | 0 |
| 1079.0 | 0 |
| 1078.0 | 0 |
| 1077.0 | 0 |
| 1076.0 | 0 |
| 1075.0 | 0 |
| 1074.0 | 0 |
| 1073.0 | 0 |
| 1072.0 | 0 |
| 1071.0 | 0 |
| 1070.0 | 0 |
| 1069.0 | 0 |
| 1068.0 | 0 |
| 1067.0 | 0 |
| 1066.0 | 0 |
| 1065.0 | 0 |
| 1064.0 | 0 |
| 1063.0 | 0 |
| 1062.0 | 0 |
| 1061.0 | 0 |
| 1060.0 | 0 |
| 1059.0 | 0 |
| 1058.0 | 0 |
| 1057.0 | 0 |
| 1056.0 | 0 |
| 1055.0 | 0 |
| 1054.0 | 0 |
| 1053.0 | 0 |
| 1052.0 | 0 |
| 1051.0 | 0 |
| 1050.0 | 0 |
| 1049.0 | 0 |
| 1048.0 | 0 |
| 1047.0 | 0 |
| 1046.0 | 0 |
| 1045.0 | 0 |
| 1044.0 | 0 |
| 1043.0 | 0 |
| 1042.0 | 0 |
| 1041.0 | 0 |
| 1040.0 | 0 |
| 1039.0 | 0 |
| 1038.0 | 0 |
| 1037.0 | 0 |
| 1036.0 | 0 |
| 1035.0 | 0 |
| 1034.0 | 0 |
| 1033.0 | 0 |
| 1032.0 | 0 |
| 1031.0 | 0 |
| 1030.0 | 0 |
| 1029.0 | 0 |
| 1028.0 | 0 |
| 1027.0 | 0 |
| 1026.0 | 0 |
| 1025.0 | 0 |
| 1024.0 | 0 |
| 1023.0 | 0 |
| 1022.0 | 0 |
| 1021.0 | 0 |
| 1020.0 | 0 |
| 1019.0 | 0 |
| 1018.0 | 0 |
| 1017.0 | 0 |
| 1016.0 | 0 |
| 1015.0 | 0 |
| 1014.0 | 0 |
| 1013.0 | 0 |
| 1012.0 | 0 |
| 1011.0 | 0 |
| 1010.0 | 0 |
| 1009.0 | 0 |
| 1008.0 | 0 |
| 1007.0 | 0 |
| 1006.0 | 0 |
| 1005.0 | 0 |
| 1004.0 | 0 |
| 1003.0 | 0 |
| 1002.0 | 0 |
| 1001.0 | 0 |
| 1000.0 | 0 |
| 999.0 | 0 |
| 998.0 | 0 |
| 997.0 | 0 |
| 996.0 | 0 |
| 995.0 | 0 |
| 994.0 | 0 |
| 993.0 | 0 |
| 992.0 | 0 |
| 991.0 | 0 |
| 990.0 | 0 |
| 989.0 | 0 |
| 988.0 | 0 |
| 987.0 | 0 |
| 986.0 | 0 |
| 985.0 | 0 |
| 984.0 | 0 |
| 983.0 | 0 |
| 982.0 | 0 |
| 981.0 | 0 |
| 980.0 | 0 |
| 979.0 | 0 |
| 978.0 | 0 |
| 977.0 | 0 |
| 976.0 | 0 |
| 975.0 | 0 |
| 974.0 | 0 |
| 973.0 | 0 |
| 972.0 | 0 |
| 971.0 | 0 |
| 970.0 | 0 |
| 969.0 | 0 |
| 968.0 | 0 |
| 967.0 | 0 |
| 966.0 | 0 |
| 965.0 | 0 |
| 964.0 | 0 |
| 963.0 | 0 |
| 962.0 | 0 |
| 961.0 | 0 |
| 960.0 | 0 |
| 959.0 | 0 |
| 958.0 | 0 |
| 957.0 | 0 |
| 956.0 | 0 |
| 955.0 | 0 |
| 954.0 | 0 |
| 953.0 | 0 |
| 952.0 | 0 |
| 951.0 | 0 |
| 950.0 | 0 |
| 949.0 | 0 |
| 948.0 | 0 |
| 947.0 | 0 |
| 946.0 | 0 |
| 945.0 | 0 |
| 944.0 | 0 |
| 943.0 | 0 |
| 942.0 | 0 |
| 941.0 | 0 |
| 940.0 | 0 |
| 939.0 | 0 |
| 938.0 | 0 |
| 937.0 | 0 |
| 936.0 | 0 |
| 935.0 | 0 |
| 934.0 | 0 |
| 933.0 | 0 |
| 932.0 | 0 |
| 931.0 | 0 |
| 930.0 | 0 |
| 929.0 | 0 |
| 928.0 | 0 |
| 927.0 | 0 |
| 926.0 | 0 |
| 925.0 | 0 |
| 924.0 | 0 |
| 923.0 | 0 |
| 922.0 | 0 |
| 921.0 | 0 |
| 920.0 | 0 |
| 919.0 | 0 |
| 918.0 | 0 |
| 917.0 | 0 |
| 916.0 | 0 |
| 915.0 | 0 |
| 914.0 | 0 |
| 913.0 | 0 |
| 912.0 | 0 |
| 911.0 | 0 |
| 910.0 | 0 |
| 909.0 | 0 |
| 908.0 | 0 |
| 907.0 | 0 |
| 906.0 | 0 |
| 905.0 | 0 |
| 904.0 | 0 |
| 903.0 | 0 |
| 902.0 | 0 |
| 901.0 | 0 |
| 900.0 | 0 |
| 899.0 | 0 |
| 898.0 | 0 |
| 897.0 | 0 |
| 896.0 | 0 |
| 895.0 | 0 |
| 894.0 | 0 |
| 893.0 | 0 |
| 892.0 | 0 |
| 891.0 | 0 |
| 890.0 | 0 |
| 889.0 | 0 |
| 888.0 | 0 |
| 887.0 | 0 |
| 886.0 | 0 |
| 885.0 | 0 |
| 884.0 | 0 |
| 883.0 | 0 |
| 882.0 | 0 |
| 881.0 | 0 |
| 880.0 | 0 |
| 879.0 | 0 |
| 878.0 | 0 |
| 877.0 | 0 |
| 876.0 | 0 |
| 875.0 | 0 |
| 874.0 | 0 |
| 873.0 | 0 |
| 872.0 | 0 |
| 871.0 | 0 |
| 870.0 | 0 |
| 869.0 | 0 |
| 868.0 | 0 |
| 867.0 | 0 |
| 866.0 | 0 |
| 865.0 | 0.001 |
| 864.0 | 0.001 |
| 863.0 | 0 |
| 862.0 | 0.001 |
| 861.0 | 0.001 |
| 860.0 | 0 |
| 859.0 | 0.001 |
| 858.0 | 0.001 |
| 857.0 | 0.001 |
| 856.0 | 0.001 |
| 855.0 | 0.001 |
| 854.0 | 0.001 |
| 853.0 | 0.001 |
| 852.0 | 0.001 |
| 851.0 | 0.001 |
| 850.0 | 0.001 |
| 849.0 | 0.001 |
| 848.0 | 0.001 |
| 847.0 | 0.001 |
| 846.0 | 0.001 |
| 845.0 | 0.001 |
| 844.0 | 0.001 |
| 843.0 | 0.001 |
| 842.0 | 0.001 |
| 841.0 | 0.001 |
| 840.0 | 0.001 |
| 839.0 | 0.001 |
| 838.0 | 0.001 |
| 837.0 | 0.001 |
| 836.0 | 0.001 |
| 835.0 | 0.001 |
| 834.0 | 0.001 |
| 833.0 | 0.001 |
| 832.0 | 0.001 |
| 831.0 | 0.001 |
| 830.0 | 0.001 |
| 829.0 | 0.001 |
| 828.0 | 0.001 |
| 827.0 | 0.002 |
| 826.0 | 0.001 |
| 825.0 | 0.002 |
| 824.0 | 0.002 |
| 823.0 | 0.002 |
| 822.0 | 0.001 |
| 821.0 | 0.002 |
| 820.0 | 0.002 |
| 819.0 | 0.001 |
| 818.0 | 0.001 |
| 817.0 | 0.001 |
| 816.0 | 0.001 |
| 815.0 | 0.002 |
| 814.0 | 0.001 |
| 813.0 | 0.002 |
| 812.0 | 0.002 |
| 811.0 | 0.002 |
| 810.0 | 0.002 |
| 809.0 | 0.002 |
| 808.0 | 0.002 |
| 807.0 | 0.002 |
| 806.0 | 0.002 |
| 805.0 | 0.002 |
| 804.0 | 0.002 |
| 803.0 | 0.002 |
| 802.0 | 0.002 |
| 801.0 | 0.002 |
| 800.0 | 0.002 |
| 799.0 | 0 |
| 798.0 | 0 |
| 797.0 | 0 |
| 796.0 | 0 |
| 795.0 | 0 |
| 794.0 | 0 |
| 793.0 | 0 |
| 792.0 | 0 |
| 791.0 | 0 |
| 790.0 | 0 |
| 789.0 | 0 |
| 788.0 | 0 |
| 787.0 | 0 |
| 786.0 | 0 |
| 785.0 | 0 |
| 784.0 | 0 |
| 783.0 | 0 |
| 782.0 | 0 |
| 781.0 | 0 |
| 780.0 | 0 |
| 779.0 | 0 |
| 778.0 | 0 |
| 777.0 | 0 |
| 776.0 | 0 |
| 775.0 | 0 |
| 774.0 | 0 |
| 773.0 | 0 |
| 772.0 | 0 |
| 771.0 | 0 |
| 770.0 | 0 |
| 769.0 | 0 |
| 768.0 | 0 |
| 767.0 | 0 |
| 766.0 | 0 |
| 765.0 | 0 |
| 764.0 | 0 |
| 763.0 | 0 |
| 762.0 | 0 |
| 761.0 | 0 |
| 760.0 | 0 |
| 759.0 | 0 |
| 758.0 | 0 |
| 757.0 | 0 |
| 756.0 | 0 |
| 755.0 | 0 |
| 754.0 | 0 |
| 753.0 | 0 |
| 752.0 | 0 |
| 751.0 | 0 |
| 750.0 | 0 |
| 749.0 | 0 |
| 748.0 | 0 |
| 747.0 | 0 |
| 746.0 | 0 |
| 745.0 | 0 |
| 744.0 | 0 |
| 743.0 | 0 |
| 742.0 | 0 |
| 741.0 | 0 |
| 740.0 | 0 |
| 739.0 | 0 |
| 738.0 | 0 |
| 737.0 | 0 |
| 736.0 | 0 |
| 735.0 | 0 |
| 734.0 | 0 |
| 733.0 | 0 |
| 732.0 | 0 |
| 731.0 | 0 |
| 730.0 | 0 |
| 729.0 | 0 |
| 728.0 | 0 |
| 727.0 | 0 |
| 726.0 | 0 |
| 725.0 | 0 |
| 724.0 | 0 |
| 723.0 | 0 |
| 722.0 | 0 |
| 721.0 | 0 |
| 720.0 | 0 |
| 719.0 | 0 |
| 718.0 | 0 |
| 717.0 | 0 |
| 716.0 | 0 |
| 715.0 | 0 |
| 714.0 | 0 |
| 713.0 | 0 |
| 712.0 | 0 |
| 711.0 | 0 |
| 710.0 | 0 |
| 709.0 | 0 |
| 708.0 | 0 |
| 707.0 | 0 |
| 706.0 | 0 |
| 705.0 | 0 |
| 704.0 | 0 |
| 703.0 | 0 |
| 702.0 | 0 |
| 701.0 | 0 |
| 700.0 | 0 |
| 699.0 | 0 |
| 698.0 | 0 |
| 697.0 | 0 |
| 696.0 | 0 |
| 695.0 | 0 |
| 694.0 | 0 |
| 693.0 | 0 |
| 692.0 | 0 |
| 691.0 | 0 |
| 690.0 | 0 |
| 689.0 | 0 |
| 688.0 | 0 |
| 687.0 | 0 |
| 686.0 | 0 |
| 685.0 | 0 |
| 684.0 | 0 |
| 683.0 | 0 |
| 682.0 | 0 |
| 681.0 | 0 |
| 680.0 | 0 |
| 679.0 | 0 |
| 678.0 | 0 |
| 677.0 | 0 |
| 676.0 | 0 |
| 675.0 | 0 |
| 674.0 | 0 |
| 673.0 | 0 |
| 672.0 | 0 |
| 671.0 | 0 |
| 670.0 | 0 |
| 669.0 | 0 |
| 668.0 | 0 |
| 667.0 | 0 |
| 666.0 | 0 |
| 665.0 | 0 |
| 664.0 | 0 |
| 663.0 | 0 |
| 662.0 | 0 |
| 661.0 | 0 |
| 660.0 | 0 |
| 659.0 | 0 |
| 658.0 | 0 |
| 657.0 | 0 |
| 656.0 | 0 |
| 655.0 | 0 |
| 654.0 | 0 |
| 653.0 | 0 |
| 652.0 | 0 |
| 651.0 | 0 |
| 650.0 | 0 |
| 649.0 | 0 |
| 648.0 | 0 |
| 647.0 | 0 |
| 646.0 | 0 |
| 645.0 | 0 |
| 644.0 | 0 |
| 643.0 | 0 |
| 642.0 | 0 |
| 641.0 | 0 |
| 640.0 | 0 |
| 639.0 | 0 |
| 638.0 | 0 |
| 637.0 | 0 |
| 636.0 | 0 |
| 635.0 | 0 |
| 634.0 | 0 |
| 633.0 | 0 |
| 632.0 | 0 |
| 631.0 | 0 |
| 630.0 | 0 |
| 629.0 | 0 |
| 628.0 | 0 |
| 627.0 | 0 |
| 626.0 | 0 |
| 625.0 | 0 |
| 624.0 | 0 |
| 623.0 | 0 |
| 622.0 | 0 |
| 621.0 | 0 |
| 620.0 | 0 |
| 619.0 | 0 |
| 618.0 | 0 |
| 617.0 | 0 |
| 616.0 | 0 |
| 615.0 | 0 |
| 614.0 | 0 |
| 613.0 | 0 |
| 612.0 | 0 |
| 611.0 | 0 |
| 610.0 | 0 |
| 609.0 | 0 |
| 608.0 | 0 |
| 607.0 | 0 |
| 606.0 | 0 |
| 605.0 | 0 |
| 604.0 | 0 |
| 603.0 | 0 |
| 602.0 | 0 |
| 601.0 | 0 |
| 600.0 | 0 |
| 599.0 | 0 |
| 598.0 | 0 |
| 597.0 | 0 |
| 596.0 | 0 |
| 595.0 | 0 |
| 594.0 | 0 |
| 593.0 | 0 |
| 592.0 | 0 |
| 591.0 | 0 |
| 590.0 | 0 |
| 589.0 | 0 |
| 588.0 | 0 |
| 587.0 | 0 |
| 586.0 | 0 |
| 585.0 | 0 |
| 584.0 | 0 |
| 583.0 | 0 |
| 582.0 | 0 |
| 581.0 | 0 |
| 580.0 | 0 |
| 579.0 | 0 |
| 578.0 | 0 |
| 577.0 | 0 |
| 576.0 | 0 |
| 575.0 | 0 |
| 574.0 | 0 |
| 573.0 | 0 |
| 572.0 | 0 |
| 571.0 | 0 |
| 570.0 | 0 |
| 569.0 | 0 |
| 568.0 | 0 |
| 567.0 | 0 |
| 566.0 | 0 |
| 565.0 | 0 |
| 564.0 | 0 |
| 563.0 | 0 |
| 562.0 | 0 |
| 561.0 | 0 |
| 560.0 | 0 |
| 559.0 | 0 |
| 558.0 | 0 |
| 557.0 | 0 |
| 556.0 | 0 |
| 555.0 | 0 |
| 554.0 | 0 |
| 553.0 | 0 |
| 552.0 | 0 |
| 551.0 | 0 |
| 550.0 | 0 |
| 549.0 | 0 |
| 548.0 | 0 |
| 547.0 | 0 |
| 546.0 | 0 |
| 545.0 | 0 |
| 544.0 | 0 |
| 543.0 | 0 |
| 542.0 | 0 |
| 541.0 | 0 |
| 540.0 | 0 |
| 539.0 | 0 |
| 538.0 | 0 |
| 537.0 | 0 |
| 536.0 | 0 |
| 535.0 | 0 |
| 534.0 | 0 |
| 533.0 | 0 |
| 532.0 | 0 |
| 531.0 | 0 |
| 530.0 | 0 |
| 529.0 | 0 |
| 528.0 | 0 |
| 527.0 | 0 |
| 526.0 | 0 |
| 525.0 | 0 |
| 524.0 | 0 |
| 523.0 | 0 |
| 522.0 | 0 |
| 521.0 | 0 |
| 520.0 | 0 |
| 519.0 | 0 |
| 518.0 | 0 |
| 517.0 | 0 |
| 516.0 | 0 |
| 515.0 | 0 |
| 514.0 | 0 |
| 513.0 | 0 |
| 512.0 | 0 |
| 511.0 | 0 |
| 510.0 | 0 |
| 509.0 | 0 |
| 508.0 | 0 |
| 507.0 | 0 |
| 506.0 | 0 |
| 505.0 | 0 |
| 504.0 | 0 |
| 503.0 | 0 |
| 502.0 | 0 |
| 501.0 | 0 |
| 500.0 | 0 |
| 499.0 | 0 |
| 498.0 | 0 |
| 497.0 | 0 |
| 496.0 | 0 |
| 495.0 | 0 |
| 494.0 | 0 |
| 493.0 | 0 |
| 492.0 | 0 |
| 491.0 | 0 |
| 490.0 | 0 |
| 489.0 | 0 |
| 488.0 | 0 |
| 487.0 | 0 |
| 486.0 | 0 |
| 485.0 | 0 |
| 484.0 | 0 |
| 483.0 | 0 |
| 482.0 | 0 |
| 481.0 | 0 |
| 480.0 | 0 |
| 479.0 | 0 |
| 478.0 | 0 |
| 477.0 | 0 |
| 476.0 | 0 |
| 475.0 | 0 |
| 474.0 | 0 |
| 473.0 | 0 |
| 472.0 | 0 |
| 471.0 | 0 |
| 470.0 | 0 |
| 469.0 | 0 |
| 468.0 | 0 |
| 467.0 | 0 |
| 466.0 | 0 |
| 465.0 | 0 |
| 464.0 | 0 |
| 463.0 | 0 |
| 462.0 | 0 |
| 461.0 | 0 |
| 460.0 | 0 |
| 459.0 | 0 |
| 458.0 | 0 |
| 457.0 | 0 |
| 456.0 | 0 |
| 455.0 | 0 |
| 454.0 | 0 |
| 453.0 | 0 |
| 452.0 | 0 |
| 451.0 | 0 |
| 450.0 | 0 |
| 449.0 | 0 |
| 448.0 | 0 |
| 447.0 | 0 |
| 446.0 | 0 |
| 445.0 | 0 |
| 444.0 | 0 |
| 443.0 | 0 |
| 442.0 | 0 |
| 441.0 | 0 |
| 440.0 | 0 |
| 439.0 | 0 |
| 438.0 | 0 |
| 437.0 | 0 |
| 436.0 | 0 |
| 435.0 | 0 |
| 434.0 | 0 |
| 433.0 | 0 |
| 432.0 | 0 |
| 431.0 | 0 |
| 430.0 | 0 |
| 429.0 | 0 |
| 428.0 | 0 |
| 427.0 | 0 |
| 426.0 | 0 |
| 425.0 | 0 |
| 424.0 | 0 |
| 423.0 | 0 |
| 422.0 | 0 |
| 421.0 | 0 |
| 420.0 | 0 |
| 419.0 | 0 |
| 418.0 | 0 |
| 417.0 | 0 |
| 416.0 | 0 |
| 415.0 | 0 |
| 414.0 | 0 |
| 413.0 | 0 |
| 412.0 | 0 |
| 411.0 | 0 |
| 410.0 | 0 |
| 409.0 | 0 |
| 408.0 | 0 |
| 407.0 | 0 |
| 406.0 | 0 |
| 405.0 | 0 |
| 404.0 | 0 |
| 403.0 | 0 |
| 402.0 | 0 |
| 401.0 | 0 |
| 400.0 | 0 |
| 399.0 | 0 |
| 398.0 | 0 |
| 397.0 | 0 |
| 396.0 | 0 |
| 395.0 | 0 |
| 394.0 | 0 |
| 393.0 | 0 |
| 392.0 | 0 |
| 391.0 | 0 |
| 390.0 | 0 |
| 389.0 | 0 |
| 388.0 | 0 |
| 387.0 | 0 |
| 386.0 | 0 |
| 385.0 | 0 |
| 384.0 | 0 |
| 383.0 | 0 |
| 382.0 | 0 |
| 381.0 | 0 |
| 380.0 | 0 |
| 379.0 | 0 |
| 378.0 | 0 |
| 377.0 | 0 |
| 376.0 | 0 |
| 375.0 | 0 |
| 374.0 | 0 |
| 373.0 | 0 |
| 372.0 | 0 |
| 371.0 | 0 |
| 370.0 | 0 |
| 369.0 | 0 |
| 368.0 | 0 |
| 367.0 | 0 |
| 366.0 | 0 |
| 365.0 | 0 |
| 364.0 | 0 |
| 363.0 | 0 |
| 362.0 | 0 |
| 361.0 | 0 |
| 360.0 | 0 |
| 359.0 | 0 |
| 358.0 | 0 |
| 357.0 | 0 |
| 356.0 | 0 |
| 355.0 | 0 |
| 354.0 | 0 |
| 353.0 | 0 |
| 352.0 | 0 |
| 351.0 | 0 |
| 350.0 | 0 |
| 349.0 | 0 |
| 348.0 | 0 |
| 347.0 | 0 |
| 346.0 | 0 |
| 345.0 | 0 |
| 344.0 | 0 |
| 343.0 | 0 |
| 342.0 | 0 |
| 341.0 | 0 |
| 340.0 | 0 |
| 339.0 | 0 |
| 338.0 | 0 |
| 337.0 | 0 |
| 336.0 | 0 |
| 335.0 | 0 |
| 334.0 | 0 |
| 333.0 | 0 |
| 332.0 | 0 |
| 331.0 | 0 |
| 330.0 | 0 |
| 329.0 | 0 |
| 328.0 | 0 |
| 327.0 | 0 |
| 326.0 | 0 |
| 325.0 | 0 |
| 324.0 | 0 |
| 323.0 | 0 |
| 322.0 | 0 |
| 321.0 | 0 |
| 320.0 | 0 |
| 319.0 | 0 |
| 318.0 | 0 |
| 317.0 | 0 |
| 316.0 | 0 |
| 315.0 | 0 |
| 314.0 | 0 |
| 313.0 | 0 |
| 312.0 | 0 |
| 311.0 | 0 |
| 310.0 | 0 |
| 309.0 | 0 |
| 308.0 | 0 |
| 307.0 | 0 |
| 306.0 | 0 |
| 305.0 | 0 |
| 304.0 | 0 |
| 303.0 | 0 |
| 302.0 | 0 |
| 301.0 | 0 |
| 300.0 | 0 |
| 299.0 | 0 |
| 298.0 | 0 |
| 297.0 | 0 |
| 296.0 | 0 |
| 295.0 | 0 |
| 294.0 | 0 |
| 293.0 | 0 |
| 292.0 | 0 |
| 291.0 | 0 |
| 290.0 | 0 |
| 289.0 | 0 |
| 288.0 | 0 |
| 287.0 | 0 |
| 286.0 | 0 |
| 285.0 | 0 |
| 284.0 | 0 |
| 283.0 | 0 |